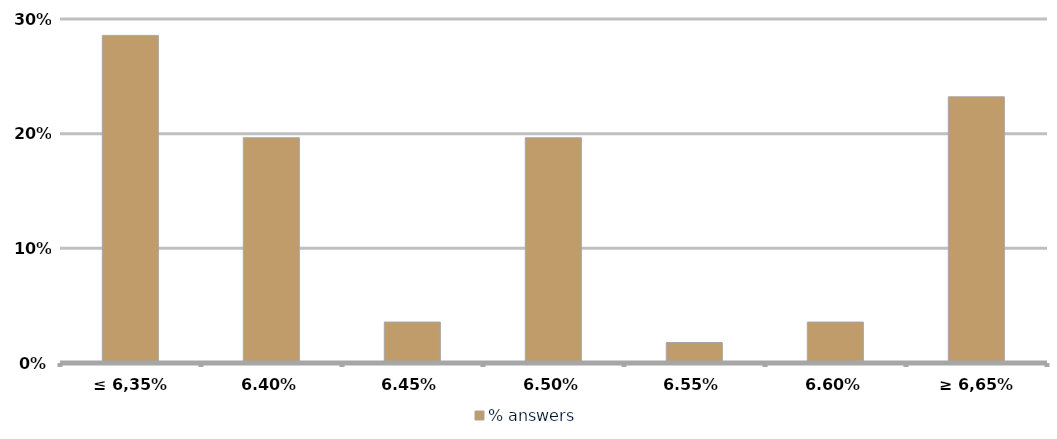
| Category | % answers |
|---|---|
| ≤ 6,35% | 0.286 |
| 6,40% | 0.196 |
| 6,45% | 0.036 |
| 6,50% | 0.196 |
| 6,55% | 0.018 |
| 6,60% | 0.036 |
| ≥ 6,65% | 0.232 |